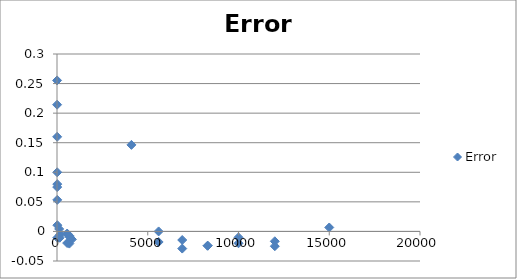
| Category | Error |
|---|---|
| 4.7 | 0.255 |
| 5.6 | 0.214 |
| 10.0 | 0.16 |
| 12.0 | 0.075 |
| 12.0 | 0.1 |
| 15.0 | 0.08 |
| 15.0 | 0.053 |
| 19.0 | 0.011 |
| 19.0 | -0.011 |
| 120.0 | 0.004 |
| 150.0 | -0.011 |
| 180.0 | -0.006 |
| 560.0 | -0.004 |
| 560.0 | -0.02 |
| 680.0 | -0.021 |
| 680.0 | -0.009 |
| 680.0 | -0.007 |
| 820.0 | -0.013 |
| 4100.0 | 0.146 |
| 5600.0 | 0 |
| 5600.0 | -0.018 |
| 6900.0 | -0.029 |
| 6900.0 | -0.014 |
| 8300.0 | -0.024 |
| 8300.0 | -0.024 |
| 10000.0 | -0.02 |
| 10000.0 | -0.01 |
| 12000.0 | -0.025 |
| 12000.0 | -0.017 |
| 15000.0 | 0.007 |